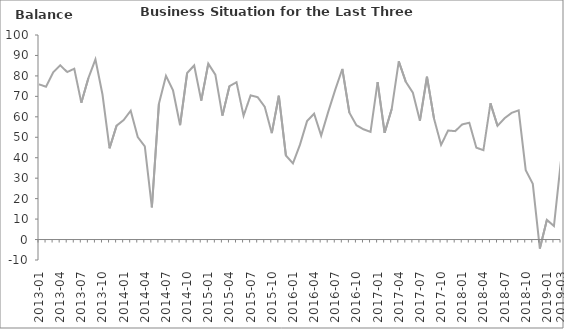
| Category | Balance |
|---|---|
| 2013-01 | 75.9 |
|  | 74.7 |
|  | 81.7 |
| 2013-04 | 85.2 |
|  | 81.9 |
|  | 83.5 |
| 2013-07 | 66.9 |
|  | 78.9 |
|  | 88.1 |
| 2013-10 | 70.9 |
|  | 44.6 |
|  | 55.7 |
| 2014-01 | 58.4 |
|  | 63 |
|  | 50.1 |
| 2014-04 | 45.6 |
|  | 15.7 |
|  | 66.4 |
| 2014-07 | 80 |
|  | 72.9 |
|  | 55.9 |
| 2014-10 | 81.4 |
|  | 85.1 |
|  | 67.9 |
| 2015-01 | 86 |
|  | 80.6 |
|  | 60.6 |
| 2015-04 | 75 |
|  | 76.9 |
|  | 60.5 |
| 2015-07 | 70.5 |
|  | 69.6 |
|  | 64.9 |
| 2015-10 | 52 |
|  | 70.3 |
|  | 41.1 |
| 2016-01 | 37.2 |
|  | 46.4 |
|  | 57.9 |
| 2016-04 | 61.5 |
|  | 50.8 |
|  | 62.4 |
| 2016-07 | 73.3 |
|  | 83.4 |
|  | 62 |
| 2016-10 | 55.9 |
|  | 53.9 |
|  | 52.6 |
| 2017-01 | 77 |
|  | 52.2 |
|  | 63.8 |
| 2017-04 | 87.1 |
|  | 77.1 |
|  | 71.8 |
| 2017-07 | 58.1 |
|  | 79.6 |
|  | 59.1 |
| 2017-10 | 46.3 |
|  | 53.3 |
|  | 53 |
| 2018-01 | 56.3 |
|  | 57.1 |
|  | 44.9 |
| 2018-04 | 43.7 |
|  | 66.6 |
|  | 55.6 |
| 2018-07 | 59.3 |
|  | 61.9 |
|  | 63.2 |
| 2018-10 | 33.9 |
|  | 27.2 |
|  | -4.4 |
| 2019-01 | 9.6 |
|  | 6.6 |
| 2019-03 | 38.8 |